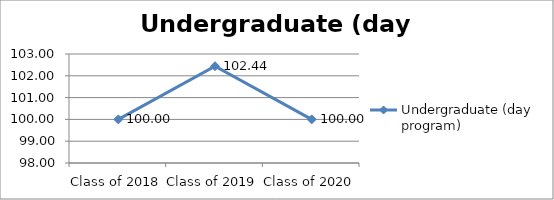
| Category | Undergraduate (day program) |
|---|---|
| Class of 2018 | 100 |
| Class of 2019 | 102.439 |
| Class of 2020 | 100 |